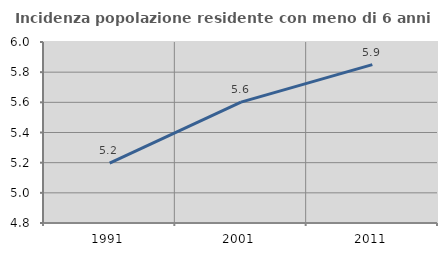
| Category | Incidenza popolazione residente con meno di 6 anni |
|---|---|
| 1991.0 | 5.197 |
| 2001.0 | 5.602 |
| 2011.0 | 5.85 |